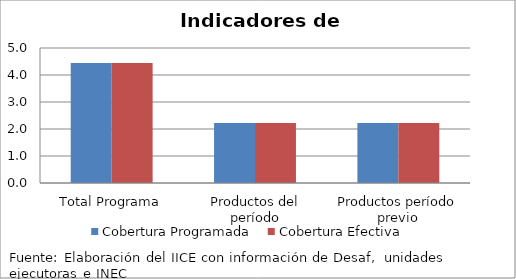
| Category | Cobertura Programada | Cobertura Efectiva |
|---|---|---|
| Total Programa | 4.446 | 4.446 |
| Productos del período | 2.223 | 2.223 |
| Productos período previo | 2.223 | 2.223 |